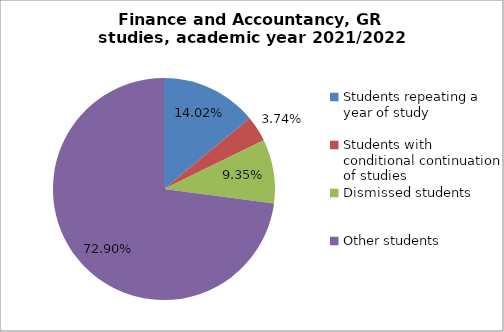
| Category | Series 0 |
|---|---|
| Students repeating a year of study | 15 |
| Students with conditional continuation of studies | 4 |
| Dismissed students | 10 |
| Other students | 78 |